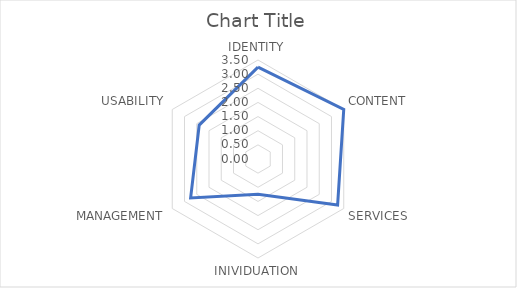
| Category | Series 0 |
|---|---|
| IDENTITY | 3.25 |
| CONTENT | 3.5 |
| SERVICES | 3.25 |
| INIVIDUATION | 1.25 |
| MANAGEMENT | 2.75 |
| USABILITY | 2.4 |